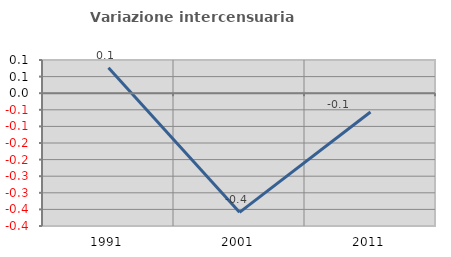
| Category | Variazione intercensuaria annua |
|---|---|
| 1991.0 | 0.077 |
| 2001.0 | -0.359 |
| 2011.0 | -0.056 |